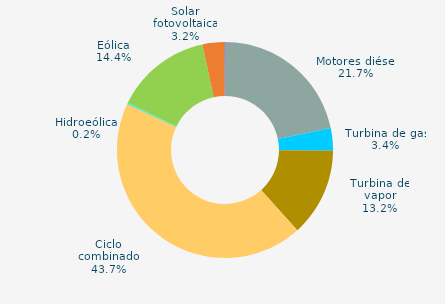
| Category | Series 0 |
|---|---|
| Motores diésel | 21.731 |
| Turbina de gas | 3.379 |
| Turbina de vapor | 13.22 |
| Ciclo combinado | 43.668 |
| Cogeneración | 0 |
| Hidráulica | 0.039 |
| Hidroeólica | 0.165 |
| Eólica | 14.441 |
| Solar fotovoltaica | 3.249 |
| Otras renovables | 0.108 |